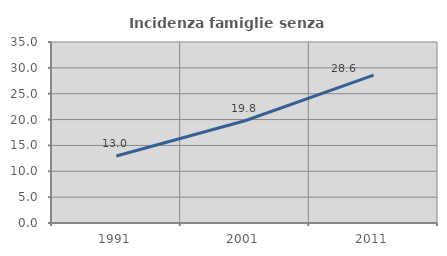
| Category | Incidenza famiglie senza nuclei |
|---|---|
| 1991.0 | 12.951 |
| 2001.0 | 19.768 |
| 2011.0 | 28.605 |